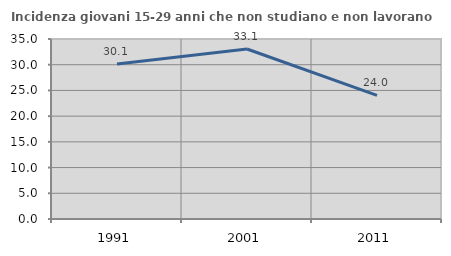
| Category | Incidenza giovani 15-29 anni che non studiano e non lavorano  |
|---|---|
| 1991.0 | 30.137 |
| 2001.0 | 33.054 |
| 2011.0 | 24.023 |